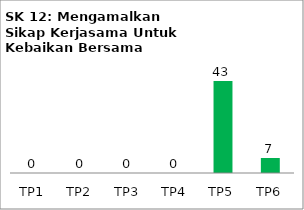
| Category | Bil Pel |
|---|---|
| TP1 | 0 |
| TP2 | 0 |
| TP3 | 0 |
| TP4 | 0 |
| TP5 | 43 |
| TP6 | 7 |